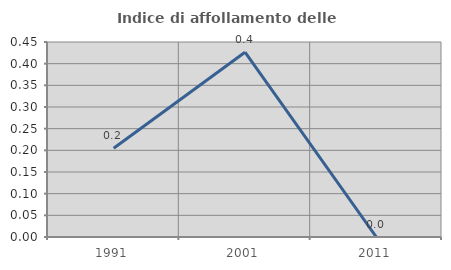
| Category | Indice di affollamento delle abitazioni  |
|---|---|
| 1991.0 | 0.205 |
| 2001.0 | 0.426 |
| 2011.0 | 0 |